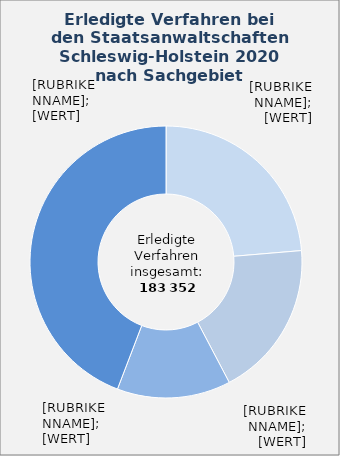
| Category | in Prozent |
|---|---|
| Sonstige allgemeine Straftaten | 0.237 |
| Betrug und Untreue | 0.186 |
| Diebstahl und Unterschlagung | 0.135 |
| Übrige Sachgebiete¹  | 0.442 |